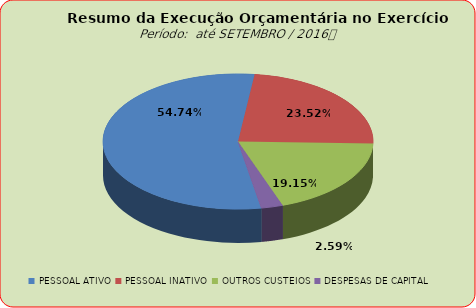
| Category | Series 0 |
|---|---|
| PESSOAL ATIVO | 100495233.93 |
| PESSOAL INATIVO | 43181577.66 |
| OUTROS CUSTEIOS | 35158407.79 |
| DESPESAS DE CAPITAL | 4749143.65 |